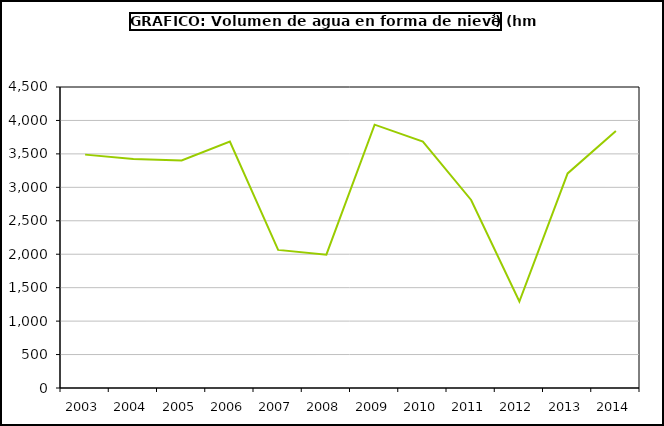
| Category | Series 0 |
|---|---|
| 2003.0 | 3489 |
| 2004.0 | 3425 |
| 2005.0 | 3401 |
| 2006.0 | 3684 |
| 2007.0 | 2065 |
| 2008.0 | 1993 |
| 2009.0 | 3937 |
| 2010.0 | 3685 |
| 2011.0 | 2811 |
| 2012.0 | 1293 |
| 2013.0 | 3208 |
| 2014.0 | 3843 |